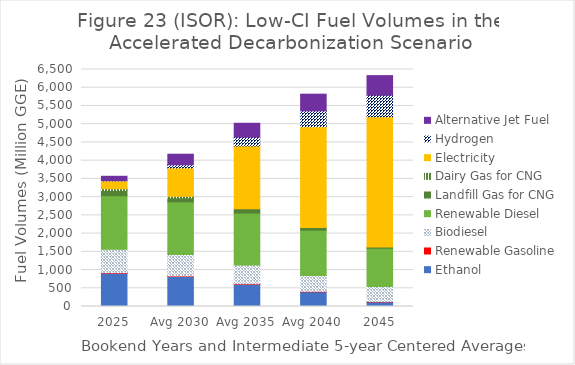
| Category | Ethanol | Renewable Gasoline | Biodiesel | Renewable Diesel | Landfill Gas for CNG | Dairy Gas for CNG | Electricity | Hydrogen | Alternative Jet Fuel |
|---|---|---|---|---|---|---|---|---|---|
| 2025 | 913.355 | 14.321 | 644.244 | 1466.113 | 145.419 | 48.452 | 213.013 | 5.314 | 120.981 |
| Avg 2030 | 823.986 | 14.122 | 586.649 | 1445.727 | 109.742 | 42.431 | 777.105 | 87.448 | 289.308 |
| Avg 2035 | 609.626 | 13.945 | 512.807 | 1427.59 | 116.57 | 0 | 1722.918 | 241.867 | 379.594 |
| Avg 2040 | 404.539 | 12.125 | 435.621 | 1241.33 | 72.937 | 0 | 2762.485 | 436.496 | 457.558 |
| 2045 | 124.439 | 10.282 | 410.443 | 1052.585 | 32.937 | 0 | 3572.892 | 592.954 | 535.522 |